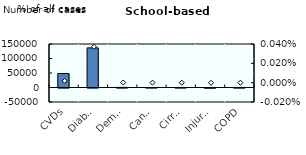
| Category | Number of cases |
|---|---|
| CVDs | 48153.76 |
| Diabetes | 136586.34 |
| Dementia | 398.769 |
| Cancers | 88.499 |
| Cirrhosis | -19.904 |
| Injuries | -683.517 |
| COPD | -130.028 |